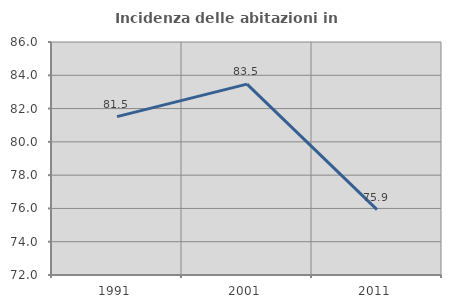
| Category | Incidenza delle abitazioni in proprietà  |
|---|---|
| 1991.0 | 81.518 |
| 2001.0 | 83.471 |
| 2011.0 | 75.931 |